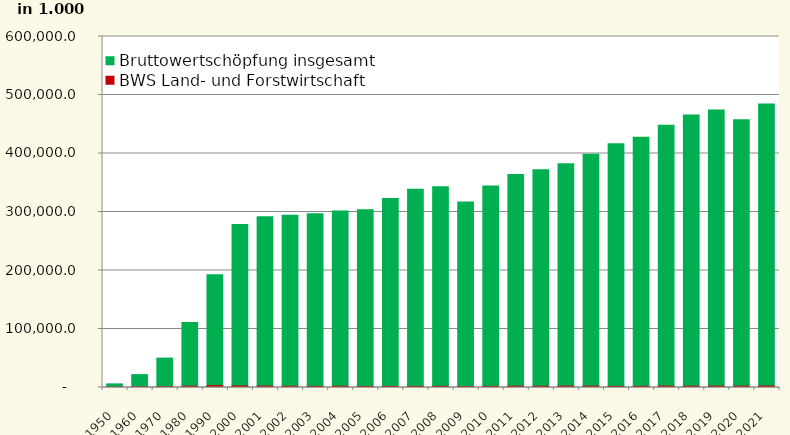
| Category | Bruttowertschöpfung insgesamt | BWS Land- und Forstwirtschaft |
|---|---|---|
| 1950.0 | 6201.459 | 710.184 |
| 1960.0 | 22017.762 | 1270.56 |
| 1970.0 | 50269.706 | 1580.403 |
| 1980.0 | 110981.016 | 2269.625 |
| 1990.0 | 192804.078 | 3292.208 |
| 2000.0 | 278472 | 2740 |
| 2001.0 | 291854 | 2467 |
| 2002.0 | 294265 | 2180 |
| 2003.0 | 297157 | 2000 |
| 2004.0 | 301923 | 2213 |
| 2005.0 | 303704 | 1883 |
| 2006.0 | 323111 | 1931 |
| 2007.0 | 339053 | 1992 |
| 2008.0 | 343369 | 2071 |
| 2009.0 | 316914 | 1723 |
| 2010.0 | 344268 | 1964 |
| 2011.0 | 364128 | 2285 |
| 2012.0 | 372395 | 2212 |
| 2013.0 | 382477 | 2420 |
| 2014.0 | 398521 | 2435 |
| 2015.0 | 416775 | 2003 |
| 2016.0 | 427603 | 2061 |
| 2017.0 | 448121 | 2471 |
| 2018.0 | 465840 | 2331 |
| 2019.0 | 474504 | 2407 |
| 2020.0 | 457789 | 2304 |
| 2021.0 | 484747 | 2608 |